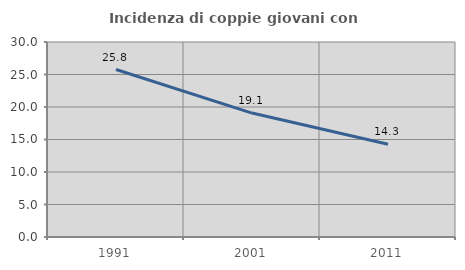
| Category | Incidenza di coppie giovani con figli |
|---|---|
| 1991.0 | 25.762 |
| 2001.0 | 19.064 |
| 2011.0 | 14.272 |